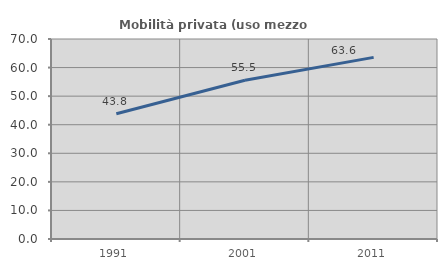
| Category | Mobilità privata (uso mezzo privato) |
|---|---|
| 1991.0 | 43.83 |
| 2001.0 | 55.541 |
| 2011.0 | 63.562 |